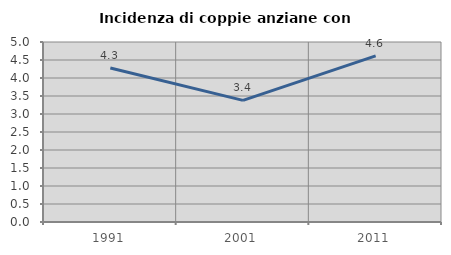
| Category | Incidenza di coppie anziane con figli |
|---|---|
| 1991.0 | 4.278 |
| 2001.0 | 3.378 |
| 2011.0 | 4.615 |